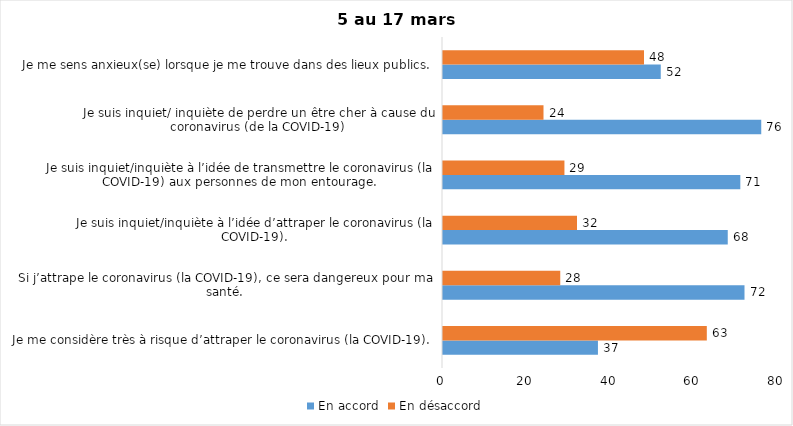
| Category | En accord | En désaccord |
|---|---|---|
| Je me considère très à risque d’attraper le coronavirus (la COVID-19). | 37 | 63 |
| Si j’attrape le coronavirus (la COVID-19), ce sera dangereux pour ma santé. | 72 | 28 |
| Je suis inquiet/inquiète à l’idée d’attraper le coronavirus (la COVID-19). | 68 | 32 |
| Je suis inquiet/inquiète à l’idée de transmettre le coronavirus (la COVID-19) aux personnes de mon entourage. | 71 | 29 |
| Je suis inquiet/ inquiète de perdre un être cher à cause du coronavirus (de la COVID-19) | 76 | 24 |
| Je me sens anxieux(se) lorsque je me trouve dans des lieux publics. | 52 | 48 |